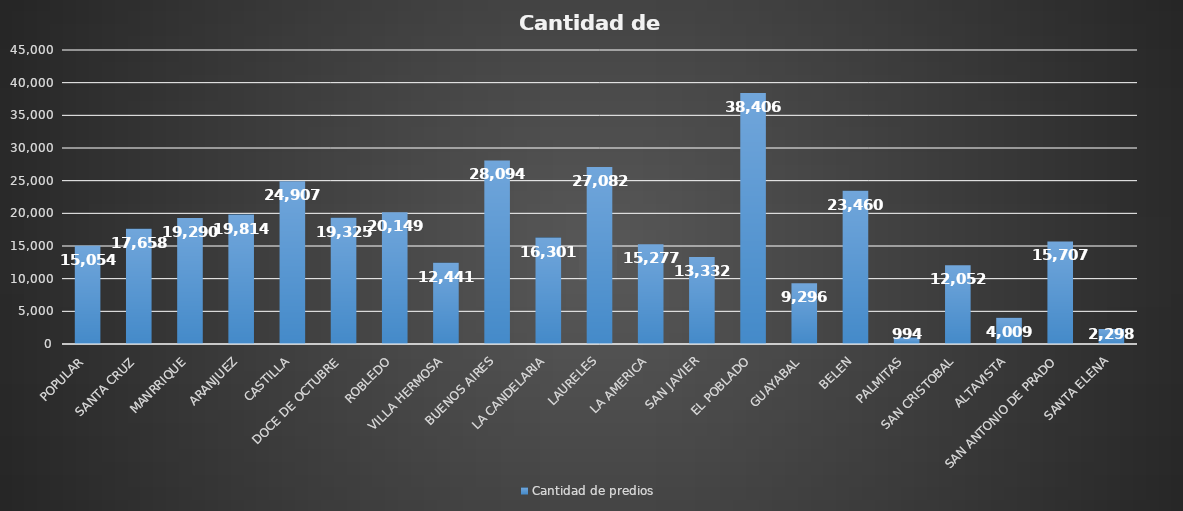
| Category | Cantidad de predios  |
|---|---|
| POPULAR | 15054 |
| SANTA CRUZ | 17658 |
| MANRRIQUE | 19290 |
| ARANJUEZ | 19814 |
| CASTILLA | 24907 |
| DOCE DE OCTUBRE | 19325 |
| ROBLEDO | 20149 |
| VILLA HERMOSA | 12441 |
| BUENOS AIRES | 28094 |
| LA CANDELARIA | 16301 |
| LAURELES | 27082 |
| LA AMERICA | 15277 |
| SAN JAVIER | 13332 |
| EL POBLADO | 38406 |
| GUAYABAL | 9296 |
| BELEN | 23460 |
| PALMITAS | 994 |
| SAN CRISTOBAL | 12052 |
| ALTAVISTA | 4009 |
| SAN ANTONIO DE PRADO | 15707 |
| SANTA ELENA | 2298 |